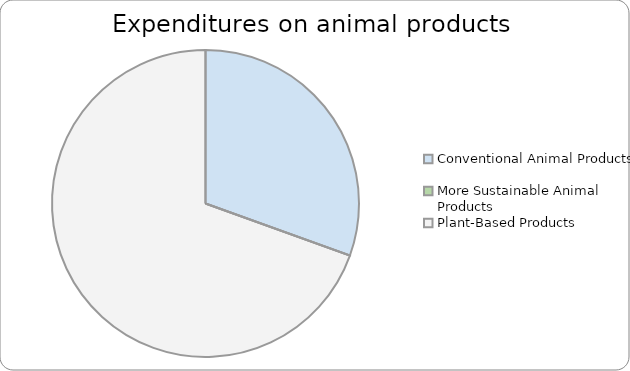
| Category | Series 0 |
|---|---|
| Conventional Animal Products | 0.305 |
| More Sustainable Animal Products | 0 |
| Plant-Based Products | 0.695 |